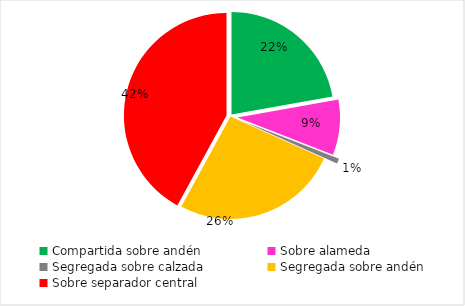
| Category | Series 0 |
|---|---|
| Compartida sobre andén | 22.193 |
| Sobre alameda | 8.721 |
| Segregada sobre calzada | 0.814 |
| Segregada sobre andén | 26.228 |
| Sobre separador central | 42.044 |